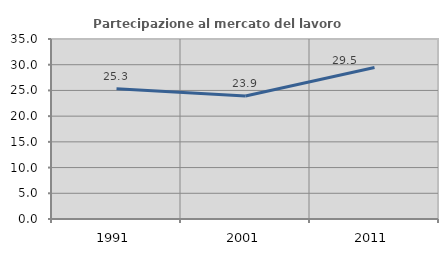
| Category | Partecipazione al mercato del lavoro  femminile |
|---|---|
| 1991.0 | 25.329 |
| 2001.0 | 23.913 |
| 2011.0 | 29.464 |